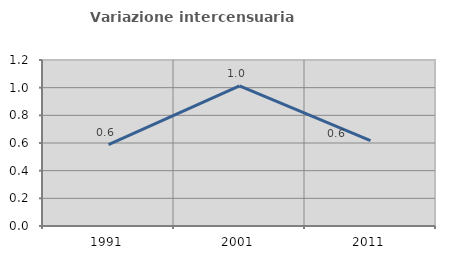
| Category | Variazione intercensuaria annua |
|---|---|
| 1991.0 | 0.588 |
| 2001.0 | 1.012 |
| 2011.0 | 0.617 |